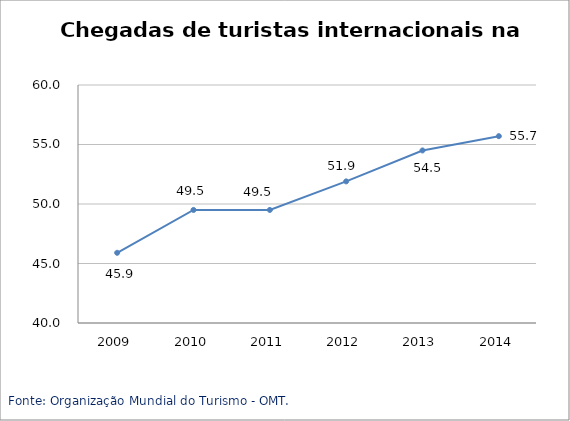
| Category | África |
|---|---|
| 2009.0 | 45.9 |
| 2010.0 | 49.5 |
| 2011.0 | 49.5 |
| 2012.0 | 51.9 |
| 2013.0 | 54.5 |
| 2014.0 | 55.7 |